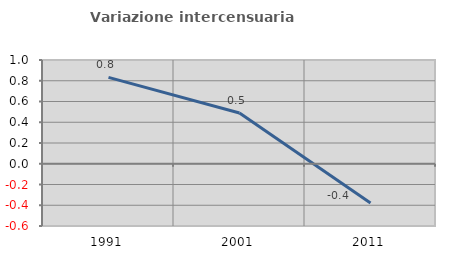
| Category | Variazione intercensuaria annua |
|---|---|
| 1991.0 | 0.833 |
| 2001.0 | 0.489 |
| 2011.0 | -0.378 |